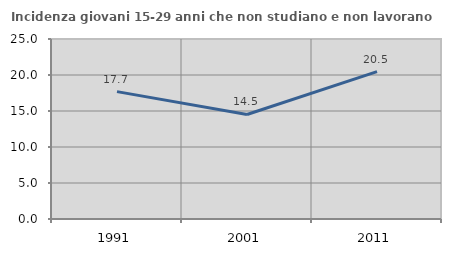
| Category | Incidenza giovani 15-29 anni che non studiano e non lavorano  |
|---|---|
| 1991.0 | 17.692 |
| 2001.0 | 14.514 |
| 2011.0 | 20.459 |